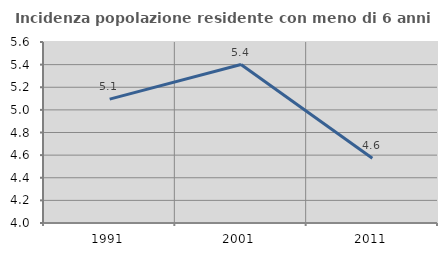
| Category | Incidenza popolazione residente con meno di 6 anni |
|---|---|
| 1991.0 | 5.095 |
| 2001.0 | 5.401 |
| 2011.0 | 4.572 |